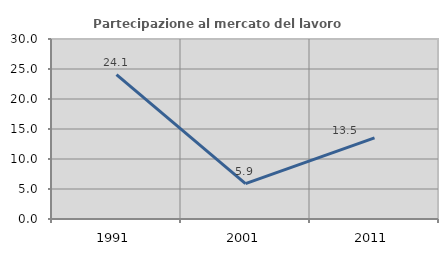
| Category | Partecipazione al mercato del lavoro  femminile |
|---|---|
| 1991.0 | 24.051 |
| 2001.0 | 5.882 |
| 2011.0 | 13.514 |